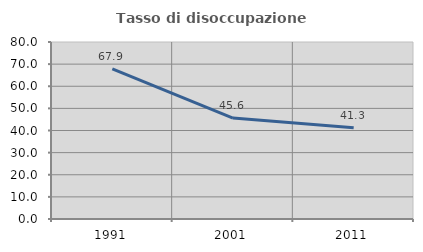
| Category | Tasso di disoccupazione giovanile  |
|---|---|
| 1991.0 | 67.872 |
| 2001.0 | 45.604 |
| 2011.0 | 41.262 |